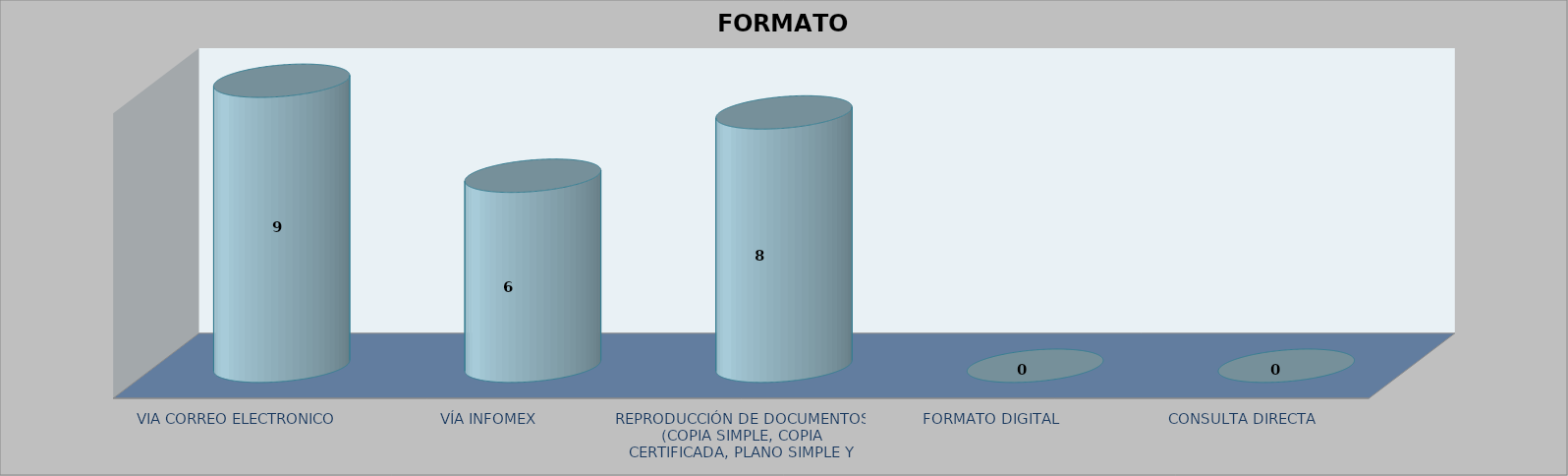
| Category |        FORMATO SOLICITADO | Series 1 | Series 2 |
|---|---|---|---|
| VIA CORREO ELECTRONICO |  |  | 9 |
| VÍA INFOMEX |  |  | 6 |
| REPRODUCCIÓN DE DOCUMENTOS (COPIA SIMPLE, COPIA CERTIFICADA, PLANO SIMPLE Y PLANO CERTIFICADO) |  |  | 8 |
| FORMATO DIGITAL |  |  | 0 |
| CONSULTA DIRECTA |  |  | 0 |